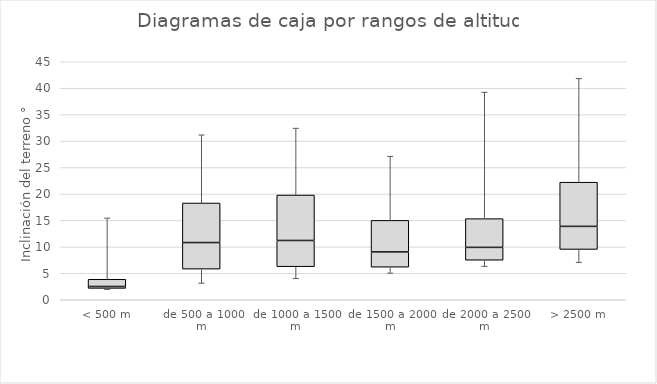
| Category | Series 0 | Series 1 | Series 2 | Series 3 | Series 4 | Series 5 |
|---|---|---|---|---|---|---|
| < 500 m | 2 | 0 | 0.15 | 0.36 | 1.36 | 12.961 |
| de 500 a 1000 m | 3 | 0.088 | 2.707 | 5.021 | 7.48 | 20.378 |
| de 1000 a 1500 m | 4 | 0.026 | 2.227 | 4.955 | 8.594 | 21.249 |
| de 1500 a 2000 m | 5 | 0.037 | 1.121 | 2.883 | 5.967 | 18.103 |
| de 2000 a 2500 m | 6 | 0.183 | 1.292 | 2.428 | 5.434 | 29.366 |
| > 2500 m | 7 | 0.058 | 2.456 | 4.362 | 8.35 | 27.98 |